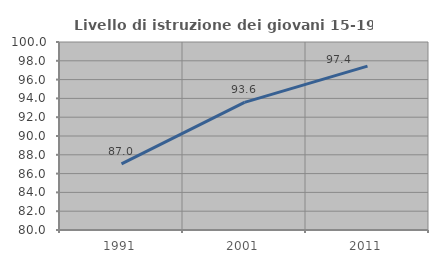
| Category | Livello di istruzione dei giovani 15-19 anni |
|---|---|
| 1991.0 | 87.036 |
| 2001.0 | 93.575 |
| 2011.0 | 97.43 |